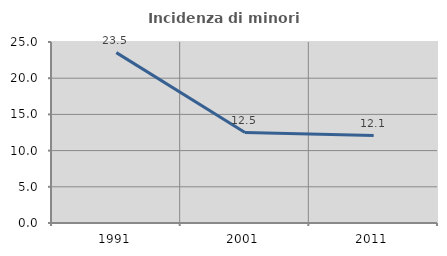
| Category | Incidenza di minori stranieri |
|---|---|
| 1991.0 | 23.529 |
| 2001.0 | 12.5 |
| 2011.0 | 12.069 |